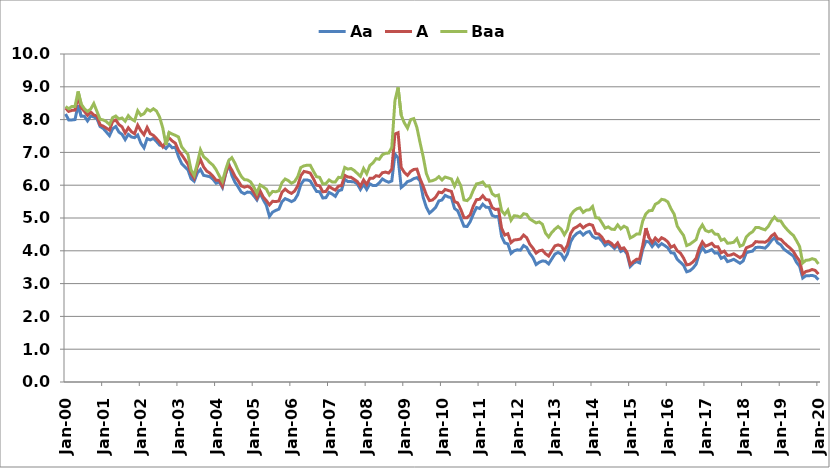
| Category | Aa | A | Baa |
|---|---|---|---|
| 2000-01-01 | 8.17 | 8.35 | 8.4 |
| 2000-02-01 | 7.99 | 8.25 | 8.33 |
| 2000-03-01 | 7.99 | 8.28 | 8.4 |
| 2000-04-01 | 8 | 8.29 | 8.4 |
| 2000-05-01 | 8.44 | 8.7 | 8.86 |
| 2000-06-01 | 8.1 | 8.36 | 8.47 |
| 2000-07-01 | 8.1 | 8.25 | 8.33 |
| 2000-08-01 | 7.96 | 8.13 | 8.25 |
| 2000-09-01 | 8.11 | 8.23 | 8.32 |
| 2000-10-01 | 8.08 | 8.14 | 8.49 |
| 2000-11-01 | 8.03 | 8.11 | 8.25 |
| 2000-12-01 | 7.79 | 7.84 | 8.01 |
| 2001-01-01 | 7.73 | 7.8 | 7.99 |
| 2001-02-01 | 7.62 | 7.74 | 7.94 |
| 2001-03-01 | 7.51 | 7.68 | 7.85 |
| 2001-04-01 | 7.72 | 7.94 | 8.06 |
| 2001-05-01 | 7.79 | 7.99 | 8.11 |
| 2001-06-01 | 7.62 | 7.85 | 8.02 |
| 2001-07-01 | 7.55 | 7.78 | 8.05 |
| 2001-08-01 | 7.39 | 7.59 | 7.95 |
| 2001-09-01 | 7.55 | 7.75 | 8.12 |
| 2001-10-01 | 7.47 | 7.63 | 8.02 |
| 2001-11-01 | 7.45 | 7.57 | 7.96 |
| 2001-12-01 | 7.53 | 7.83 | 8.27 |
| 2002-01-01 | 7.28 | 7.66 | 8.13 |
| 2002-02-01 | 7.14 | 7.54 | 8.18 |
| 2002-03-01 | 7.42 | 7.76 | 8.32 |
| 2002-04-01 | 7.38 | 7.57 | 8.26 |
| 2002-05-01 | 7.43 | 7.52 | 8.33 |
| 2002-06-01 | 7.33 | 7.42 | 8.26 |
| 2002-07-01 | 7.22 | 7.31 | 8.07 |
| 2002-08-01 | 7.2 | 7.17 | 7.74 |
| 2002-09-01 | 7.12 | 7.32 | 7.23 |
| 2002-10-01 | 7.24 | 7.44 | 7.61 |
| 2002-11-01 | 7.14 | 7.35 | 7.56 |
| 2002-12-01 | 7.16 | 7.28 | 7.52 |
| 2003-01-01 | 6.87 | 7.06 | 7.47 |
| 2003-02-01 | 6.66 | 6.93 | 7.17 |
| 2003-03-01 | 6.56 | 6.79 | 7.05 |
| 2003-04-01 | 6.47 | 6.64 | 6.94 |
| 2003-05-01 | 6.2 | 6.36 | 6.47 |
| 2003-06-01 | 6.12 | 6.21 | 6.3 |
| 2003-07-01 | 6.37 | 6.57 | 6.67 |
| 2003-08-01 | 6.48 | 6.78 | 7.08 |
| 2003-09-01 | 6.3 | 6.56 | 6.87 |
| 2003-10-01 | 6.28 | 6.43 | 6.79 |
| 2003-11-01 | 6.26 | 6.37 | 6.69 |
| 2003-12-01 | 6.18 | 6.27 | 6.61 |
| 2004-01-01 | 6.06 | 6.15 | 6.47 |
| 2004-02-01 | 6.1 | 6.15 | 6.28 |
| 2004-03-01 | 5.93 | 5.97 | 6.12 |
| 2004-04-01 | 6.33 | 6.35 | 6.46 |
| 2004-05-01 | 6.66 | 6.62 | 6.75 |
| 2004-06-01 | 6.3 | 6.46 | 6.84 |
| 2004-07-01 | 6.09 | 6.27 | 6.67 |
| 2004-08-01 | 5.95 | 6.14 | 6.45 |
| 2004-09-01 | 5.79 | 5.98 | 6.27 |
| 2004-10-01 | 5.74 | 5.94 | 6.17 |
| 2004-11-01 | 5.79 | 5.97 | 6.16 |
| 2004-12-01 | 5.78 | 5.92 | 6.1 |
| 2005-01-01 | 5.68 | 5.78 | 5.95 |
| 2005-02-01 | 5.55 | 5.61 | 5.76 |
| 2005-03-01 | 5.76 | 5.83 | 6.01 |
| 2005-04-01 | 5.56 | 5.64 | 5.95 |
| 2005-05-01 | 5.39 | 5.53 | 5.88 |
| 2005-06-01 | 5.05 | 5.4 | 5.7 |
| 2005-07-01 | 5.18 | 5.51 | 5.81 |
| 2005-08-01 | 5.23 | 5.5 | 5.8 |
| 2005-09-01 | 5.27 | 5.52 | 5.83 |
| 2005-10-01 | 5.5 | 5.79 | 6.08 |
| 2005-11-01 | 5.59 | 5.88 | 6.19 |
| 2005-12-01 | 5.55 | 5.8 | 6.14 |
| 2006-01-01 | 5.5 | 5.75 | 6.06 |
| 2006-02-01 | 5.55 | 5.82 | 6.11 |
| 2006-03-01 | 5.71 | 5.98 | 6.26 |
| 2006-04-01 | 6.02 | 6.29 | 6.54 |
| 2006-05-01 | 6.16 | 6.42 | 6.59 |
| 2006-06-01 | 6.16 | 6.4 | 6.61 |
| 2006-07-01 | 6.13 | 6.37 | 6.61 |
| 2006-08-01 | 5.97 | 6.2 | 6.43 |
| 2006-09-01 | 5.81 | 6 | 6.26 |
| 2006-10-01 | 5.8 | 5.98 | 6.24 |
| 2006-11-01 | 5.61 | 5.8 | 6.04 |
| 2006-12-01 | 5.62 | 5.81 | 6.05 |
| 2007-01-01 | 5.78 | 5.96 | 6.16 |
| 2007-02-01 | 5.73 | 5.9 | 6.1 |
| 2007-03-01 | 5.66 | 5.85 | 6.1 |
| 2007-04-01 | 5.83 | 5.97 | 6.24 |
| 2007-05-01 | 5.86 | 5.99 | 6.23 |
| 2007-06-01 | 6.18 | 6.3 | 6.54 |
| 2007-07-01 | 6.11 | 6.25 | 6.49 |
| 2007-08-01 | 6.11 | 6.24 | 6.51 |
| 2007-09-01 | 6.1 | 6.18 | 6.45 |
| 2007-10-01 | 6.04 | 6.11 | 6.36 |
| 2007-11-01 | 5.87 | 5.97 | 6.27 |
| 2007-12-01 | 6.03 | 6.16 | 6.51 |
| 2008-01-01 | 5.87 | 6.02 | 6.35 |
| 2008-02-01 | 6.04 | 6.21 | 6.6 |
| 2008-03-01 | 5.99 | 6.21 | 6.68 |
| 2008-04-01 | 5.99 | 6.29 | 6.81 |
| 2008-05-01 | 6.07 | 6.27 | 6.79 |
| 2008-06-01 | 6.19 | 6.38 | 6.93 |
| 2008-07-01 | 6.13 | 6.4 | 6.97 |
| 2008-08-01 | 6.09 | 6.37 | 6.98 |
| 2008-09-01 | 6.13 | 6.49 | 7.15 |
| 2008-10-01 | 6.95 | 7.56 | 8.58 |
| 2008-11-01 | 6.83 | 7.6 | 8.98 |
| 2008-12-01 | 5.93 | 6.54 | 8.13 |
| 2009-01-01 | 6.01 | 6.39 | 7.9 |
| 2009-02-01 | 6.11 | 6.3 | 7.74 |
| 2009-03-01 | 6.14 | 6.42 | 8 |
| 2009-04-01 | 6.2 | 6.48 | 8.03 |
| 2009-05-01 | 6.23 | 6.49 | 7.76 |
| 2009-06-01 | 6.13 | 6.2 | 7.3 |
| 2009-07-01 | 5.63 | 5.97 | 6.87 |
| 2009-08-01 | 5.33 | 5.71 | 6.36 |
| 2009-09-01 | 5.15 | 5.53 | 6.12 |
| 2009-10-01 | 5.23 | 5.55 | 6.14 |
| 2009-11-01 | 5.33 | 5.64 | 6.18 |
| 2009-12-01 | 5.52 | 5.79 | 6.26 |
| 2010-01-01 | 5.55 | 5.77 | 6.16 |
| 2010-02-01 | 5.69 | 5.87 | 6.25 |
| 2010-03-01 | 5.64 | 5.84 | 6.22 |
| 2010-04-01 | 5.62 | 5.81 | 6.19 |
| 2010-05-01 | 5.29 | 5.5 | 5.97 |
| 2010-06-01 | 5.22 | 5.46 | 6.18 |
| 2010-07-01 | 4.99 | 5.26 | 5.98 |
| 2010-08-01 | 4.75 | 5.01 | 5.55 |
| 2010-09-01 | 4.74 | 5.01 | 5.53 |
| 2010-10-01 | 4.89 | 5.1 | 5.62 |
| 2010-11-01 | 5.12 | 5.37 | 5.85 |
| 2010-12-01 | 5.32 | 5.56 | 6.04 |
| 2011-01-01 | 5.29 | 5.57 | 6.06 |
| 2011-02-01 | 5.42 | 5.68 | 6.1 |
| 2011-03-01 | 5.33 | 5.56 | 5.97 |
| 2011-04-01 | 5.32 | 5.55 | 5.98 |
| 2011-05-01 | 5.08 | 5.32 | 5.74 |
| 2011-06-01 | 5.04 | 5.26 | 5.67 |
| 2011-07-01 | 5.05 | 5.27 | 5.7 |
| 2011-08-01 | 4.44 | 4.69 | 5.22 |
| 2011-09-01 | 4.24 | 4.48 | 5.11 |
| 2011-10-01 | 4.21 | 4.52 | 5.24 |
| 2011-11-01 | 3.92 | 4.25 | 4.93 |
| 2011-12-01 | 4 | 4.33 | 5.07 |
| 2012-01-01 | 4.03 | 4.34 | 5.06 |
| 2012-02-01 | 4.02 | 4.36 | 5.02 |
| 2012-03-01 | 4.16 | 4.48 | 5.13 |
| 2012-04-01 | 4.1 | 4.4 | 5.11 |
| 2012-05-01 | 3.92 | 4.2 | 4.97 |
| 2012-06-01 | 3.79 | 4.08 | 4.91 |
| 2012-07-01 | 3.58 | 3.93 | 4.85 |
| 2012-08-01 | 3.65 | 4 | 4.88 |
| 2012-09-01 | 3.69 | 4.02 | 4.81 |
| 2012-10-01 | 3.68 | 3.91 | 4.54 |
| 2012-11-01 | 3.6 | 3.84 | 4.42 |
| 2012-12-01 | 3.75 | 4 | 4.56 |
| 2013-01-01 | 3.9 | 4.15 | 4.66 |
| 2013-02-01 | 3.95 | 4.18 | 4.74 |
| 2013-03-01 | 3.9 | 4.15 | 4.66 |
| 2013-04-01 | 3.74 | 4 | 4.49 |
| 2013-05-01 | 3.91 | 4.17 | 4.65 |
| 2013-06-01 | 4.27 | 4.53 | 5.08 |
| 2013-07-01 | 4.44 | 4.68 | 5.21 |
| 2013-08-01 | 4.53 | 4.73 | 5.28 |
| 2013-09-01 | 4.58 | 4.8 | 5.31 |
| 2013-10-01 | 4.48 | 4.7 | 5.17 |
| 2013-11-01 | 4.56 | 4.77 | 5.24 |
| 2013-12-01 | 4.59 | 4.81 | 5.25 |
| 2014-01-01 | 4.44 | 4.778 | 5.351 |
| 2014-02-01 | 4.38 | 4.53 | 5.01 |
| 2014-03-01 | 4.4 | 4.51 | 5 |
| 2014-04-01 | 4.3 | 4.41 | 4.85 |
| 2014-05-01 | 4.16 | 4.26 | 4.69 |
| 2014-06-01 | 4.23 | 4.29 | 4.73 |
| 2014-07-01 | 4.16 | 4.23 | 4.66 |
| 2014-08-01 | 4.07 | 4.13 | 4.65 |
| 2014-09-01 | 4.18 | 4.24 | 4.79 |
| 2014-10-01 | 3.98 | 4.06 | 4.67 |
| 2014-11-01 | 4.03 | 4.09 | 4.75 |
| 2014-12-01 | 3.9 | 3.95 | 4.7 |
| 2015-01-01 | 3.52 | 3.58 | 4.39 |
| 2015-02-01 | 3.62 | 3.67 | 4.44 |
| 2015-03-01 | 3.67 | 3.74 | 4.51 |
| 2015-04-01 | 3.63 | 3.75 | 4.51 |
| 2015-05-01 | 4.05 | 4.17 | 4.91 |
| 2015-06-01 | 4.29 | 4.69 | 5.13 |
| 2015-07-01 | 4.27 | 4.4 | 5.22 |
| 2015-08-01 | 4.13 | 4.25 | 5.23 |
| 2015-09-01 | 4.25 | 4.39 | 5.42 |
| 2015-10-01 | 4.13 | 4.29 | 5.47 |
| 2015-11-01 | 4.22 | 4.4 | 5.57 |
| 2015-12-01 | 4.16 | 4.35 | 5.55 |
| 2016-01-01 | 4.09 | 4.27 | 5.49 |
| 2016-02-01 | 3.94 | 4.11 | 5.28 |
| 2016-03-01 | 3.93 | 4.16 | 5.12 |
| 2016-04-01 | 3.74 | 4 | 4.75 |
| 2016-05-01 | 3.65 | 3.93 | 4.6 |
| 2016-06-01 | 3.56 | 3.78 | 4.47 |
| 2016-07-01 | 3.36 | 3.57 | 4.16 |
| 2016-08-01 | 3.39 | 3.59 | 4.2 |
| 2016-09-01 | 3.47 | 3.66 | 4.27 |
| 2016-10-01 | 3.59 | 3.77 | 4.34 |
| 2016-11-01 | 3.91 | 4.08 | 4.64 |
| 2016-12-01 | 4.11 | 4.27 | 4.79 |
| 2017-01-01 | 3.96 | 4.14 | 4.62 |
| 2017-02-01 | 3.99 | 4.18 | 4.58 |
| 2017-03-01 | 4.04 | 4.23 | 4.62 |
| 2017-04-01 | 3.93 | 4.12 | 4.51 |
| 2017-05-01 | 3.94 | 4.12 | 4.5 |
| 2017-06-01 | 3.77 | 3.94 | 4.32 |
| 2017-07-01 | 3.82 | 3.99 | 4.36 |
| 2017-08-01 | 3.67 | 3.86 | 4.23 |
| 2017-09-01 | 3.7 | 3.87 | 4.24 |
| 2017-10-01 | 3.74 | 3.91 | 4.26 |
| 2017-11-01 | 3.68 | 3.85 | 4.37 |
| 2017-12-01 | 3.62 | 3.79 | 4.14 |
| 2018-01-01 | 3.69 | 3.86 | 4.18 |
| 2018-02-01 | 3.94 | 4.09 | 4.42 |
| 2018-03-01 | 3.97 | 4.13 | 4.52 |
| 2018-04-01 | 3.99 | 4.17 | 4.58 |
| 2018-05-01 | 4.1 | 4.28 | 4.71 |
| 2018-06-01 | 4.11 | 4.27 | 4.71 |
| 2018-07-01 | 4.1 | 4.27 | 4.67 |
| 2018-08-01 | 4.08 | 4.26 | 4.64 |
| 2018-09-01 | 4.18 | 4.32 | 4.74 |
| 2018-10-01 | 4.31 | 4.45 | 4.91 |
| 2018-11-01 | 4.4 | 4.52 | 5.03 |
| 2018-12-01 | 4.24 | 4.37 | 4.92 |
| 2019-01-01 | 4.18 | 4.35 | 4.91 |
| 2019-02-01 | 4.05 | 4.25 | 4.76 |
| 2019-03-01 | 3.98 | 4.16 | 4.65 |
| 2019-04-01 | 3.91 | 4.08 | 4.55 |
| 2019-05-01 | 3.84 | 3.98 | 4.47 |
| 2019-06-01 | 3.65 | 3.82 | 4.31 |
| 2019-07-01 | 3.53 | 3.69 | 4.13 |
| 2019-08-01 | 3.17 | 3.29 | 3.63 |
| 2019-09-01 | 3.24 | 3.37 | 3.71 |
| 2019-10-01 | 3.24 | 3.39 | 3.72 |
| 2019-11-01 | 3.25 | 3.43 | 3.76 |
| 2019-12-01 | 3.22 | 3.4 | 3.73 |
| 2020-01-01 | 3.12 | 3.29 | 3.6 |